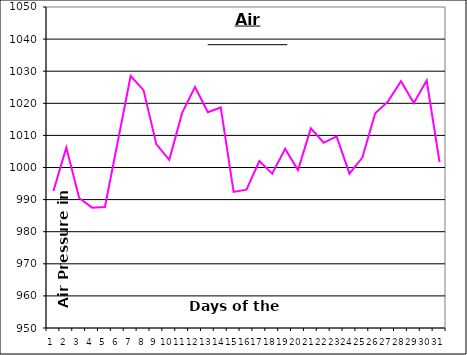
| Category | Series 0 |
|---|---|
| 0 | 992.7 |
| 1 | 1006.2 |
| 2 | 990.5 |
| 3 | 987.5 |
| 4 | 987.7 |
| 5 | 1008.1 |
| 6 | 1028.5 |
| 7 | 1024.1 |
| 8 | 1007.2 |
| 9 | 1002.4 |
| 10 | 1017 |
| 11 | 1025.1 |
| 12 | 1017.2 |
| 13 | 1018.7 |
| 14 | 992.4 |
| 15 | 993.1 |
| 16 | 1002 |
| 17 | 998.1 |
| 18 | 1005.8 |
| 19 | 999.2 |
| 20 | 1012.2 |
| 21 | 1007.7 |
| 22 | 1009.7 |
| 23 | 998.1 |
| 24 | 1003.1 |
| 25 | 1016.9 |
| 26 | 1020.6 |
| 27 | 1026.9 |
| 28 | 1020.1 |
| 29 | 1027.1 |
| 30 | 1001.7 |